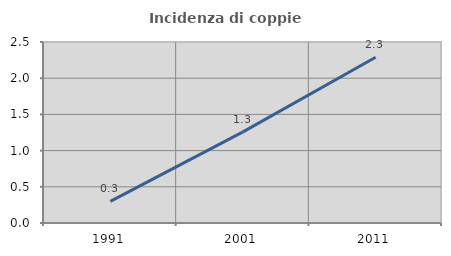
| Category | Incidenza di coppie miste |
|---|---|
| 1991.0 | 0.298 |
| 2001.0 | 1.258 |
| 2011.0 | 2.29 |